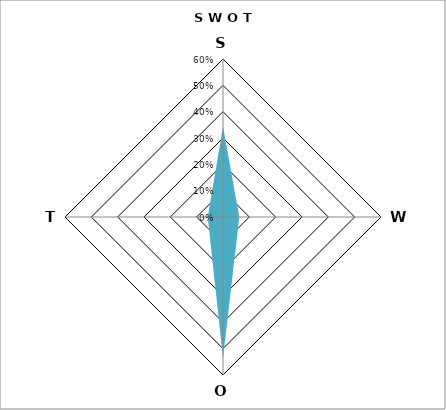
| Category | S W O T |
|---|---|
| S | 0.344 |
| W | 0.062 |
| O | 0.536 |
| T | 0.058 |